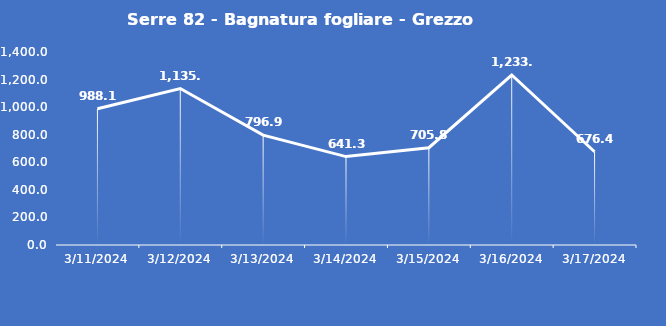
| Category | Serre 82 - Bagnatura fogliare - Grezzo (min) |
|---|---|
| 3/11/24 | 988.1 |
| 3/12/24 | 1135 |
| 3/13/24 | 796.9 |
| 3/14/24 | 641.3 |
| 3/15/24 | 705.8 |
| 3/16/24 | 1233.1 |
| 3/17/24 | 676.4 |